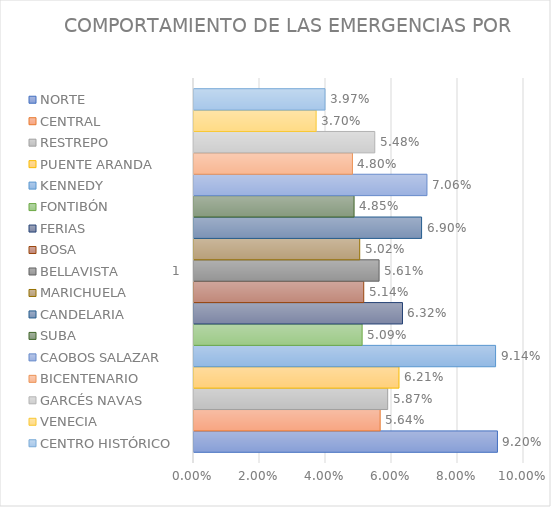
| Category | NORTE | CENTRAL | RESTREPO | PUENTE ARANDA | KENNEDY | FONTIBÓN | FERIAS | BOSA | BELLAVISTA | MARICHUELA | CANDELARIA | SUBA | CAOBOS SALAZAR | BICENTENARIO | GARCÉS NAVAS | VENECIA | CENTRO HISTÓRICO |
|---|---|---|---|---|---|---|---|---|---|---|---|---|---|---|---|---|---|
| 0 | 0.092 | 0.056 | 0.059 | 0.062 | 0.091 | 0.051 | 0.063 | 0.051 | 0.056 | 0.05 | 0.069 | 0.049 | 0.071 | 0.048 | 0.055 | 0.037 | 0.04 |